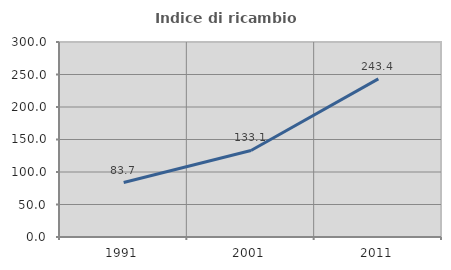
| Category | Indice di ricambio occupazionale  |
|---|---|
| 1991.0 | 83.74 |
| 2001.0 | 133.09 |
| 2011.0 | 243.354 |